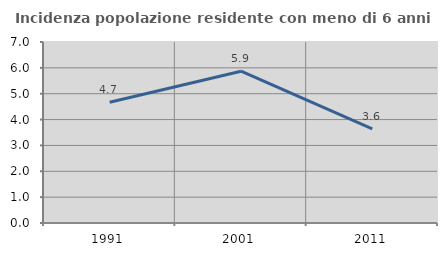
| Category | Incidenza popolazione residente con meno di 6 anni |
|---|---|
| 1991.0 | 4.672 |
| 2001.0 | 5.872 |
| 2011.0 | 3.64 |